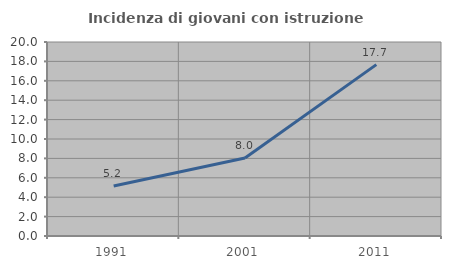
| Category | Incidenza di giovani con istruzione universitaria |
|---|---|
| 1991.0 | 5.152 |
| 2001.0 | 8.043 |
| 2011.0 | 17.666 |